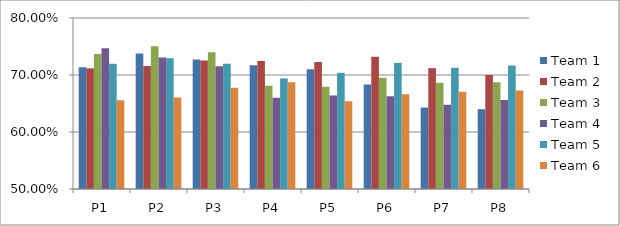
| Category | Team 1 | Team 2 | Team 3 | Team 4 | Team 5 | Team 6 |
|---|---|---|---|---|---|---|
| P1 | 0.714 | 0.712 | 0.737 | 0.747 | 0.72 | 0.656 |
| P2 | 0.738 | 0.716 | 0.75 | 0.731 | 0.73 | 0.66 |
| P3 | 0.727 | 0.725 | 0.74 | 0.716 | 0.72 | 0.678 |
| P4 | 0.717 | 0.725 | 0.681 | 0.66 | 0.694 | 0.687 |
| P5 | 0.71 | 0.723 | 0.68 | 0.664 | 0.704 | 0.654 |
| P6 | 0.683 | 0.732 | 0.695 | 0.663 | 0.721 | 0.666 |
| P7 | 0.643 | 0.712 | 0.686 | 0.648 | 0.713 | 0.671 |
| P8 | 0.64 | 0.7 | 0.687 | 0.656 | 0.717 | 0.673 |